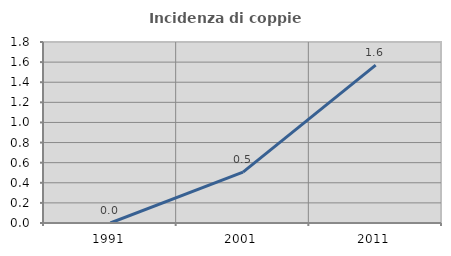
| Category | Incidenza di coppie miste |
|---|---|
| 1991.0 | 0 |
| 2001.0 | 0.506 |
| 2011.0 | 1.571 |